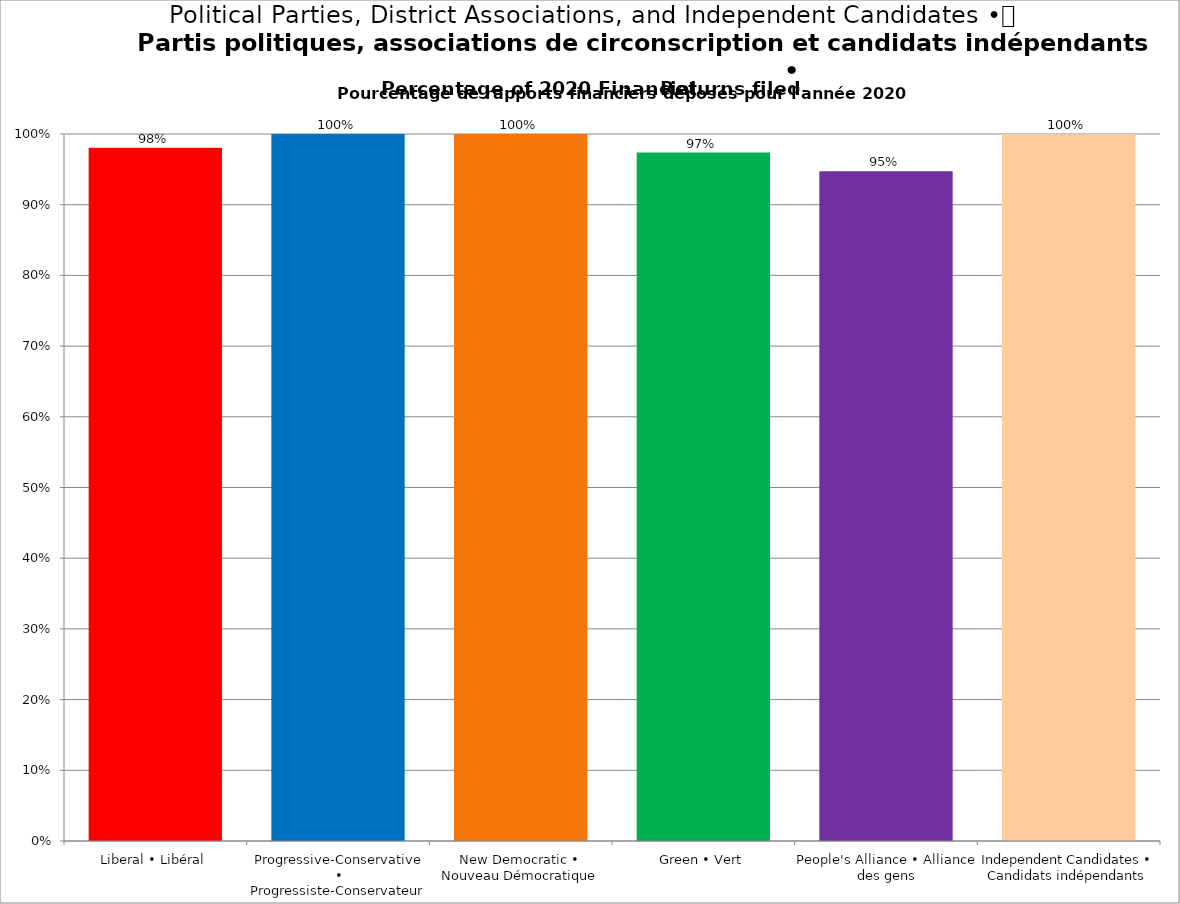
| Category | Series 0 | Series 2 | Series 4 |
|---|---|---|---|
| Liberal • Libéral | 0.98 |  |  |
| Progressive-Conservative • Progressiste-Conservateur | 1 |  |  |
| New Democratic • Nouveau Démocratique | 1 |  |  |
| Green • Vert | 0.974 |  |  |
| People's Alliance • Alliance des gens | 0.947 |  |  |
| Independent Candidates • Candidats indépendants | 1 |  |  |